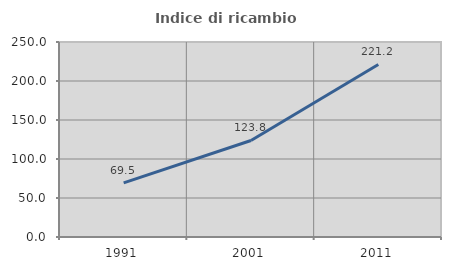
| Category | Indice di ricambio occupazionale  |
|---|---|
| 1991.0 | 69.48 |
| 2001.0 | 123.768 |
| 2011.0 | 221.196 |